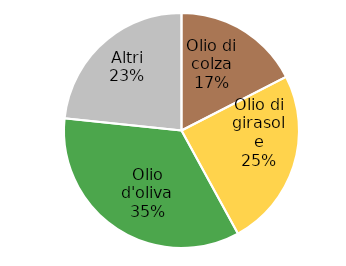
| Category | Series 0 |
|---|---|
| Olio di colza | 4847.152 |
| Olio di girasole | 6831.901 |
| Olio d'oliva | 9621.549 |
| Altri | 6483.97 |